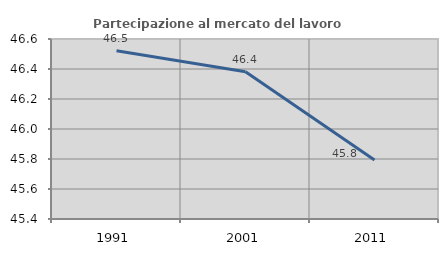
| Category | Partecipazione al mercato del lavoro  femminile |
|---|---|
| 1991.0 | 46.522 |
| 2001.0 | 46.382 |
| 2011.0 | 45.793 |